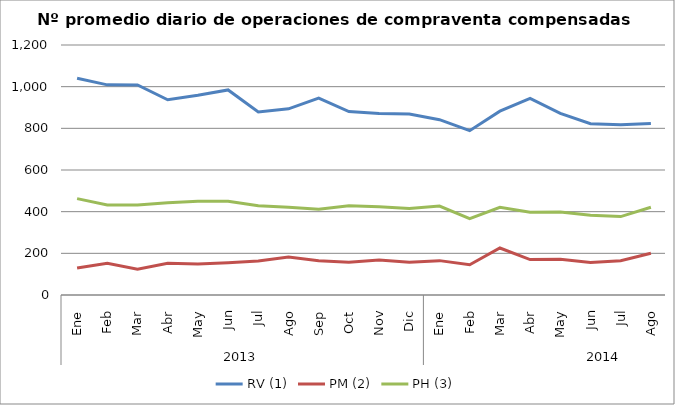
| Category | RV (1) | PM (2) | PH (3) |
|---|---|---|---|
| 0 | 1040.636 | 129.682 | 462.545 |
| 1 | 1008.7 | 152.35 | 432.05 |
| 2 | 1008.45 | 123.6 | 431.9 |
| 3 | 937.091 | 152.273 | 442.545 |
| 4 | 958.381 | 148.429 | 449.571 |
| 5 | 984.3 | 154.95 | 450 |
| 6 | 878.955 | 163.091 | 427.955 |
| 7 | 893.762 | 182.333 | 420.857 |
| 8 | 945.278 | 164.944 | 411.222 |
| 9 | 880.5 | 156.955 | 428.864 |
| 10 | 871.35 | 167.95 | 423.25 |
| 11 | 868.85 | 156.75 | 415.75 |
| 12 | 841.591 | 164.955 | 427.091 |
| 13 | 788.8 | 144.95 | 366.85 |
| 14 | 882.238 | 225.667 | 421.238 |
| 15 | 944 | 170.238 | 397.381 |
| 16 | 871.55 | 171.45 | 398.25 |
| 17 | 822.476 | 155.857 | 382.905 |
| 18 | 816.818 | 164.682 | 376.318 |
| 19 | 823.65 | 200.7 | 421.15 |